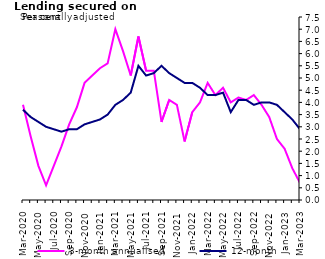
| Category | 3-month annualised | 12-month |
|---|---|---|
| Mar-2020 | 3.9 | 3.7 |
| Apr-2020 | 2.6 | 3.4 |
| May-2020 | 1.4 | 3.2 |
| Jun-2020 | 0.6 | 3 |
| Jul-2020 | 1.4 | 2.9 |
| Aug-2020 | 2.2 | 2.8 |
| Sep-2020 | 3.1 | 2.9 |
| Oct-2020 | 3.8 | 2.9 |
| Nov-2020 | 4.8 | 3.1 |
| Dec-2020 | 5.1 | 3.2 |
| Jan-2021 | 5.4 | 3.3 |
| Feb-2021 | 5.6 | 3.5 |
| Mar-2021 | 7 | 3.9 |
| Apr-2021 | 6.1 | 4.1 |
| May-2021 | 5.1 | 4.4 |
| Jun-2021 | 6.7 | 5.5 |
| Jul-2021 | 5.3 | 5.1 |
| Aug-2021 | 5.3 | 5.2 |
| Sep-2021 | 3.2 | 5.5 |
| Oct-2021 | 4.1 | 5.2 |
| Nov-2021 | 3.9 | 5 |
| Dec-2021 | 2.4 | 4.8 |
| Jan-2022 | 3.6 | 4.8 |
| Feb-2022 | 4 | 4.6 |
| Mar-2022 | 4.8 | 4.3 |
| Apr-2022 | 4.3 | 4.3 |
| May-2022 | 4.6 | 4.4 |
| Jun-2022 | 4 | 3.6 |
| Jul-2022 | 4.2 | 4.1 |
| Aug-2022 | 4.1 | 4.1 |
| Sep-2022 | 4.3 | 3.9 |
| Oct-2022 | 3.9 | 4 |
| Nov-2022 | 3.4 | 4 |
| Dec-2022 | 2.5 | 3.9 |
| Jan-2023 | 2.1 | 3.6 |
| Feb-2023 | 1.3 | 3.3 |
| Mar-2023 | 0.7 | 2.9 |